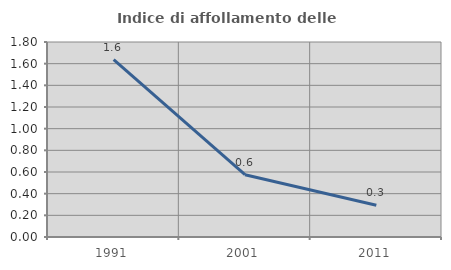
| Category | Indice di affollamento delle abitazioni  |
|---|---|
| 1991.0 | 1.636 |
| 2001.0 | 0.575 |
| 2011.0 | 0.294 |